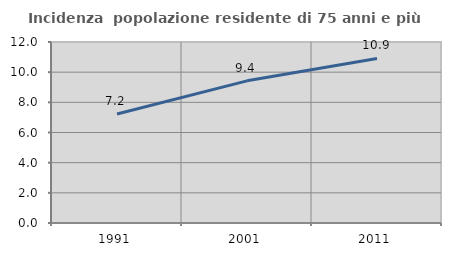
| Category | Incidenza  popolazione residente di 75 anni e più |
|---|---|
| 1991.0 | 7.226 |
| 2001.0 | 9.425 |
| 2011.0 | 10.913 |